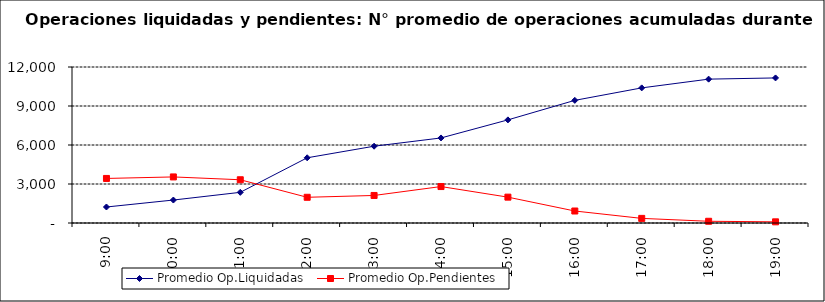
| Category | Promedio Op.Liquidadas | Promedio Op.Pendientes |
|---|---|---|
| 0.375 | 1230.913 | 3427.087 |
| 0.4166666666666667 | 1766.087 | 3543.739 |
| 0.4583333333333333 | 2358.783 | 3326.652 |
| 0.5 | 5015.957 | 1977.565 |
| 0.5416666666666666 | 5906.261 | 2118.304 |
| 0.5833333333333334 | 6542.087 | 2803.522 |
| 0.625 | 7931.739 | 1988.739 |
| 0.6666666666666666 | 9434.13 | 922.087 |
| 0.7083333333333334 | 10393.478 | 354.652 |
| 0.75 | 11066.391 | 133.261 |
| 0.7916666666666666 | 11159.13 | 89.739 |